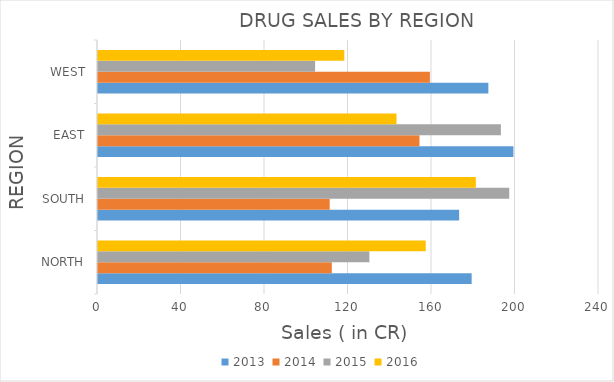
| Category | 2013 | 2014 | 2015 | 2016 |
|---|---|---|---|---|
| NORTH | 179 | 112 | 130 | 157 |
| SOUTH | 173 | 111 | 197 | 181 |
| EAST | 199 | 154 | 193 | 143 |
| WEST | 187 | 159 | 104 | 118 |